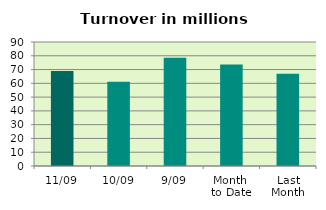
| Category | Series 0 |
|---|---|
| 11/09 | 68.861 |
| 10/09 | 61.169 |
| 9/09 | 78.595 |
| Month 
to Date | 73.686 |
| Last
Month | 66.948 |